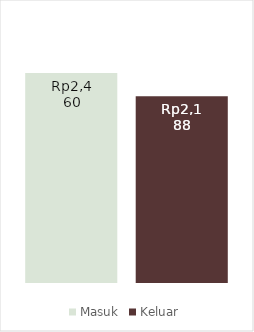
| Category | Masuk | Keluar |
|---|---|---|
| 0 | 2460 | 2188.333 |